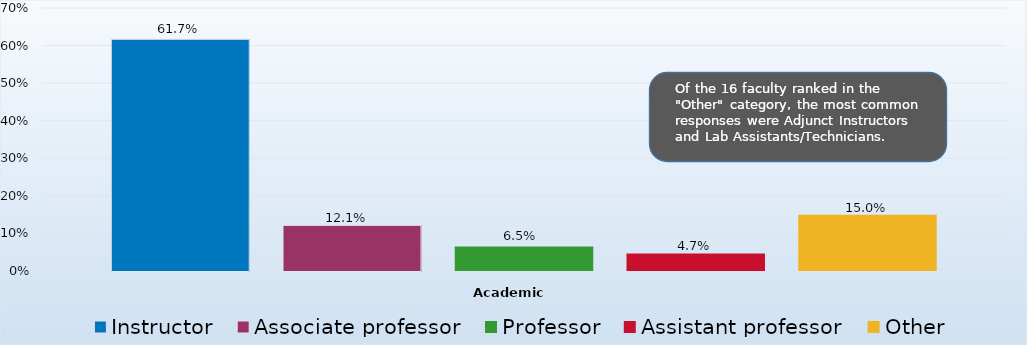
| Category | Instructor | Associate professor | Professor | Assistant professor | Other |
|---|---|---|---|---|---|
| 0 | 0.617 | 0.121 | 0.065 | 0.047 | 0.15 |